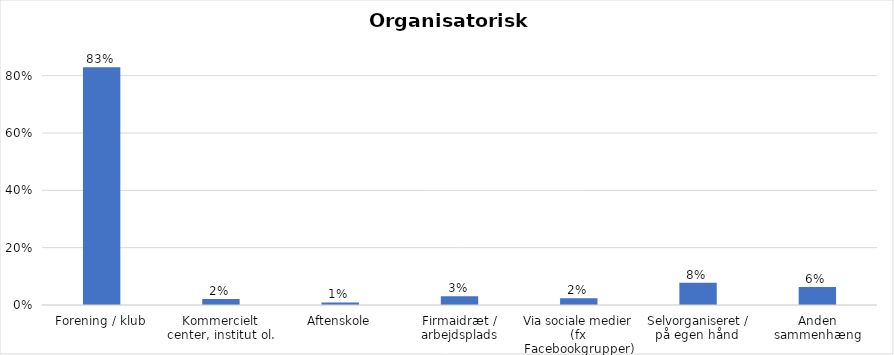
| Category | % |
|---|---|
| Forening / klub | 0.829 |
| Kommercielt center, institut ol. | 0.021 |
| Aftenskole | 0.009 |
| Firmaidræt / arbejdsplads | 0.03 |
| Via sociale medier (fx Facebookgrupper) | 0.024 |
| Selvorganiseret / på egen hånd  | 0.077 |
| Anden sammenhæng | 0.063 |